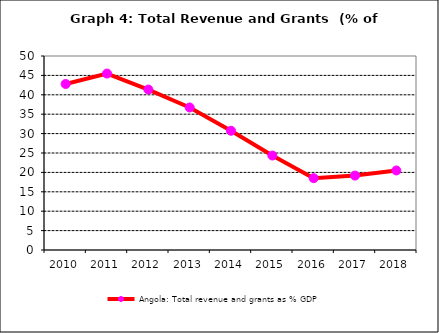
| Category | Angola: Total revenue and grants as % GDP |
|---|---|
| 2010.0 | 42.789 |
| 2011.0 | 45.477 |
| 2012.0 | 41.351 |
| 2013.0 | 36.734 |
| 2014.0 | 30.733 |
| 2015.0 | 24.346 |
| 2016.0 | 18.517 |
| 2017.0 | 19.181 |
| 2018.0 | 20.498 |